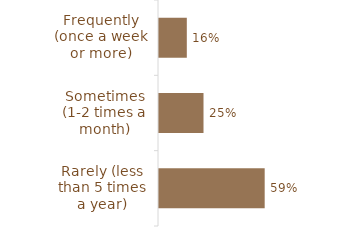
| Category | Total |
|---|---|
| Rarely (less than 5 times a year) | 0.594 |
| Sometimes (1-2 times a month) | 0.25 |
| Frequently (once a week or more) | 0.156 |